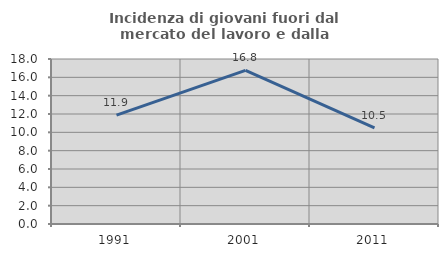
| Category | Incidenza di giovani fuori dal mercato del lavoro e dalla formazione  |
|---|---|
| 1991.0 | 11.875 |
| 2001.0 | 16.754 |
| 2011.0 | 10.484 |